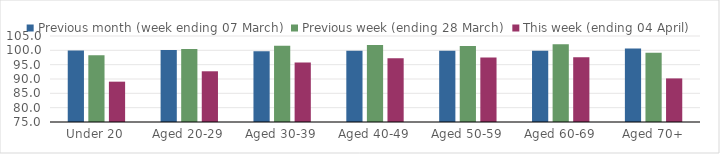
| Category | Previous month (week ending 07 March) | Previous week (ending 28 March) | This week (ending 04 April) |
|---|---|---|---|
| Under 20 | 99.978 | 98.3 | 89.07 |
| Aged 20-29 | 100.09 | 100.448 | 92.691 |
| Aged 30-39 | 99.694 | 101.628 | 95.791 |
| Aged 40-49 | 99.896 | 101.867 | 97.268 |
| Aged 50-59 | 99.883 | 101.552 | 97.491 |
| Aged 60-69 | 99.829 | 102.114 | 97.612 |
| Aged 70+ | 100.618 | 99.124 | 90.207 |